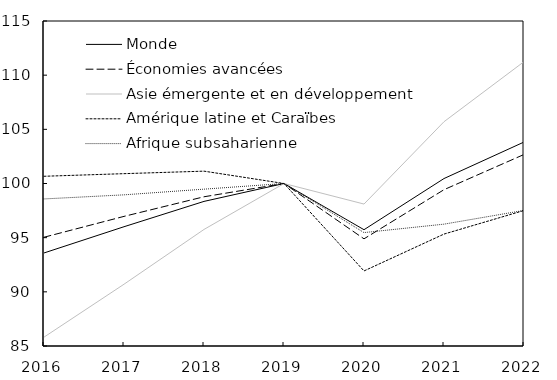
| Category | Monde | Économies avancées | Asie émergente et en développement | Amérique latine et Caraïbes | Afrique subsaharienne |
|---|---|---|---|---|---|
| 2016.0 | 93.588 | 95.039 | 85.817 | 100.667 | 98.575 |
| 2017.0 | 96.01 | 96.965 | 90.703 | 100.908 | 98.953 |
| 2018.0 | 98.349 | 98.775 | 95.76 | 101.14 | 99.478 |
| 2019.0 | 100 | 100 | 100 | 100 | 100 |
| 2020.0 | 95.735 | 94.893 | 98.103 | 91.929 | 95.468 |
| 2021.0 | 100.459 | 99.429 | 105.704 | 95.331 | 96.247 |
| 2022.0 | 103.827 | 102.678 | 111.247 | 97.51 | 97.518 |